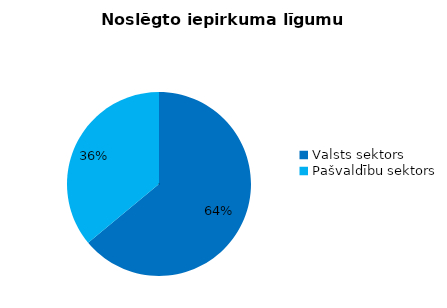
| Category | Noslēgto iepirkuma līgumu skaits |
|---|---|
| Valsts sektors | 375 |
| Pašvaldību sektors | 211 |